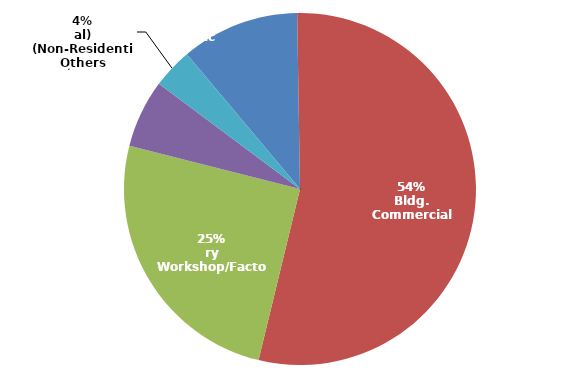
| Category | Series 0 |
|---|---|
| ادارة حكومية
Public Building | 47 |
| مبنى تجاري
Commercial Bldg. | 234 |
| ورشة / مصنع
Workshop/Factory | 109 |
| مسجد
Mosque | 27 |
| أخرى
Others (Non-Residential) | 16 |